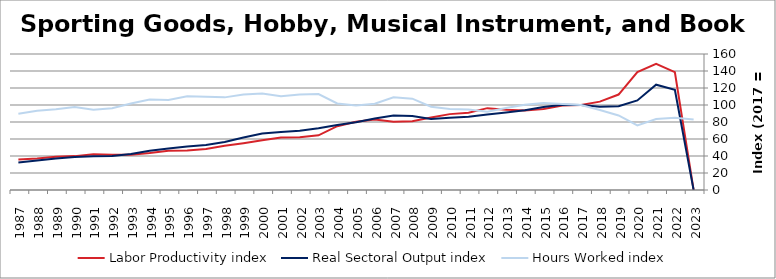
| Category | Labor Productivity index | Real Sectoral Output index | Hours Worked index |
|---|---|---|---|
| 2023.0 | 0 | 0 | 83.019 |
| 2022.0 | 138.622 | 117.898 | 85.05 |
| 2021.0 | 148.481 | 123.922 | 83.46 |
| 2020.0 | 138.775 | 105.334 | 75.903 |
| 2019.0 | 112.309 | 98.472 | 87.679 |
| 2018.0 | 103.984 | 97.888 | 94.138 |
| 2017.0 | 100 | 100 | 100 |
| 2016.0 | 99.359 | 100.416 | 101.063 |
| 2015.0 | 95.408 | 97.693 | 102.394 |
| 2014.0 | 93.434 | 93.706 | 100.291 |
| 2013.0 | 94.481 | 91.239 | 96.568 |
| 2012.0 | 96.306 | 88.769 | 92.174 |
| 2011.0 | 90.968 | 86.097 | 94.645 |
| 2010.0 | 89.268 | 85.142 | 95.378 |
| 2009.0 | 85.303 | 83.55 | 97.944 |
| 2008.0 | 81.015 | 87.068 | 107.471 |
| 2007.0 | 80.374 | 87.74 | 109.164 |
| 2006.0 | 82.898 | 84.069 | 101.412 |
| 2005.0 | 80.2 | 79.714 | 99.393 |
| 2004.0 | 75.042 | 76.446 | 101.87 |
| 2003.0 | 64.33 | 72.662 | 112.952 |
| 2002.0 | 62.189 | 69.802 | 112.241 |
| 2001.0 | 61.815 | 68.257 | 110.422 |
| 2000.0 | 58.531 | 66.468 | 113.56 |
| 1999.0 | 55.025 | 61.814 | 112.337 |
| 1998.0 | 51.926 | 56.587 | 108.974 |
| 1997.0 | 48.32 | 53.047 | 109.782 |
| 1996.0 | 46.519 | 51.254 | 110.18 |
| 1995.0 | 46.134 | 48.851 | 105.89 |
| 1994.0 | 43.416 | 46.213 | 106.442 |
| 1993.0 | 41.553 | 42.259 | 101.698 |
| 1992.0 | 41.58 | 39.982 | 96.158 |
| 1991.0 | 41.961 | 39.626 | 94.435 |
| 1990.0 | 39.854 | 38.958 | 97.751 |
| 1989.0 | 39.087 | 37.091 | 94.894 |
| 1988.0 | 37.166 | 34.648 | 93.225 |
| 1987.0 | 35.956 | 32.25 | 89.695 |